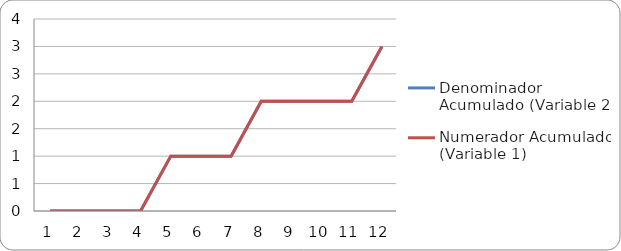
| Category | Denominador Acumulado (Variable 2) | Numerador Acumulado (Variable 1) |
|---|---|---|
| 0 | 0 | 0 |
| 1 | 0 | 0 |
| 2 | 0 | 0 |
| 3 | 0 | 0 |
| 4 | 1 | 1 |
| 5 | 1 | 1 |
| 6 | 1 | 1 |
| 7 | 2 | 2 |
| 8 | 2 | 2 |
| 9 | 2 | 2 |
| 10 | 2 | 2 |
| 11 | 3 | 3 |